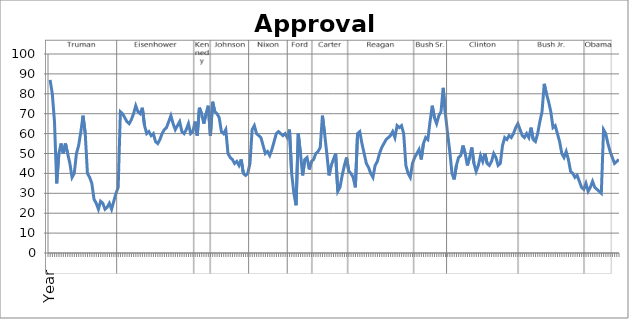
| Category | Approval Rating |
|---|---|
| Year | 87 |
| 1946 | 80 |
|  | 66 |
|  | 35 |
|  | 50 |
| 1947 | 55 |
|  | 50 |
|  | 55 |
|  | 50 |
| 1948 | 45 |
|  | 38 |
|  | 40 |
|  | 50 |
| 1949 | 54 |
|  | 61 |
|  | 69 |
|  | 60 |
| 1950 | 40 |
|  | 38 |
|  | 35 |
|  | 27 |
| 1951 | 25 |
|  | 22 |
|  | 26 |
|  | 25 |
| 1952 | 22 |
|  | 23 |
|  | 25 |
|  | 22 |
| 1953 | 26 |
|  | 30 |
|  | 33 |
|  | 71 |
| 1954 | 70 |
|  | 68 |
|  | 66 |
|  | 65 |
| 1955 | 67 |
|  | 70 |
|  | 74 |
|  | 71 |
| 1956 | 70 |
|  | 73 |
|  | 64 |
|  | 60 |
| 1957 | 61 |
|  | 59 |
|  | 60 |
|  | 56 |
| 1958 | 55 |
|  | 57 |
|  | 60 |
|  | 62 |
| 1959 | 63 |
|  | 66 |
|  | 69 |
|  | 65 |
| 1960 | 62 |
|  | 64 |
|  | 66 |
|  | 61 |
| 1961 | 60 |
|  | 62 |
|  | 65 |
|  | 60 |
| 1962 | 61 |
|  | 66 |
|  | 59 |
|  | 73 |
| 1963 | 70 |
|  | 65 |
|  | 70 |
|  | 74 |
| 1964 | 59 |
|  | 76 |
|  | 71 |
|  | 70 |
| 1965 | 68 |
|  | 61 |
|  | 60 |
|  | 62 |
| 1966 | 50 |
|  | 48 |
|  | 47 |
|  | 45 |
| 1967 | 46 |
|  | 44 |
|  | 47 |
|  | 40 |
| 1968 | 39 |
|  | 40 |
|  | 45 |
|  | 62 |
| 1969 | 64 |
|  | 60 |
|  | 59 |
|  | 58 |
| 1970 | 54 |
|  | 50 |
|  | 51 |
|  | 49 |
| 1971 | 52 |
|  | 56 |
|  | 60 |
|  | 61 |
| 1972 | 60 |
|  | 59 |
|  | 60 |
|  | 58 |
| 1973 | 62 |
|  | 40 |
|  | 30 |
|  | 24 |
| 1974 | 60 |
|  | 50 |
|  | 39 |
|  | 47 |
| 1975 | 48 |
|  | 42 |
|  | 46 |
|  | 47 |
| 1976 | 50 |
|  | 51 |
|  | 53 |
|  | 69 |
| 1977 | 60 |
|  | 50 |
|  | 39 |
|  | 44 |
| 1978 | 47 |
|  | 50 |
|  | 31 |
|  | 33 |
| 1979 | 39 |
|  | 44 |
|  | 48 |
|  | 41 |
| 1980 | 40 |
|  | 38 |
|  | 33 |
|  | 60 |
| 1981 | 61 |
|  | 55 |
|  | 50 |
|  | 45 |
| 1982 | 43 |
|  | 40 |
|  | 38 |
|  | 44 |
| 1983 | 46 |
|  | 50 |
|  | 53 |
|  | 55 |
| 1984 | 57 |
|  | 58 |
|  | 59 |
|  | 61 |
| 1985 | 58 |
|  | 64 |
|  | 63 |
|  | 64 |
| 1986 | 60 |
|  | 44 |
|  | 40 |
|  | 38 |
| 1987 | 45 |
|  | 48 |
|  | 50 |
|  | 52 |
| 1988 | 47 |
|  | 55 |
|  | 58 |
|  | 57 |
| 1989 | 66 |
|  | 74 |
|  | 68 |
|  | 65 |
| 1990 | 69 |
|  | 71 |
|  | 83 |
|  | 70 |
| 1991 | 60 |
|  | 51 |
|  | 40 |
|  | 37 |
| 1992 | 44 |
|  | 48 |
|  | 49 |
|  | 54 |
| 1993 | 50 |
|  | 44 |
|  | 48 |
|  | 53 |
| 1994 | 45 |
|  | 41 |
|  | 44 |
|  | 49 |
| 1995 | 46 |
|  | 50 |
|  | 45 |
|  | 44 |
| 1996 | 46 |
|  | 50 |
|  | 48 |
|  | 44 |
| 1997 | 45 |
|  | 54 |
|  | 58 |
|  | 57 |
| 1998 | 59 |
|  | 58 |
|  | 60 |
|  | 63 |
| 1999 | 65 |
|  | 62 |
|  | 59 |
|  | 58 |
| 2000 | 60 |
|  | 58 |
|  | 63 |
|  | 57 |
| 2001 | 56 |
|  | 60 |
|  | 66 |
|  | 71 |
| 2002 | 85 |
|  | 80 |
|  | 76 |
|  | 71 |
| 2003 | 63 |
|  | 64 |
|  | 60 |
|  | 56 |
| 2004 | 50 |
|  | 48 |
|  | 51 |
|  | 47 |
| 2005 | 41 |
|  | 40 |
|  | 38 |
|  | 39 |
| 2006 | 36 |
|  | 33 |
|  | 32 |
|  | 35 |
| 2007 | 31 |
|  | 33 |
|  | 36 |
|  | 33 |
| 2008 | 32 |
|  | 31 |
|  | 30 |
|  | 62 |
| 2009 | 60 |
|  | 55 |
|  | 51 |
|  | 48 |
| 2010 | 45 |